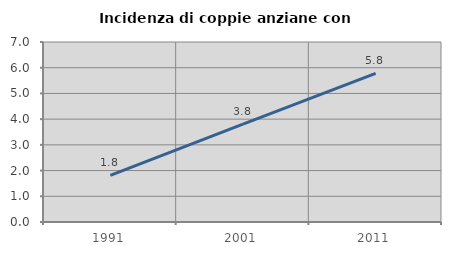
| Category | Incidenza di coppie anziane con figli |
|---|---|
| 1991.0 | 1.815 |
| 2001.0 | 3.81 |
| 2011.0 | 5.782 |